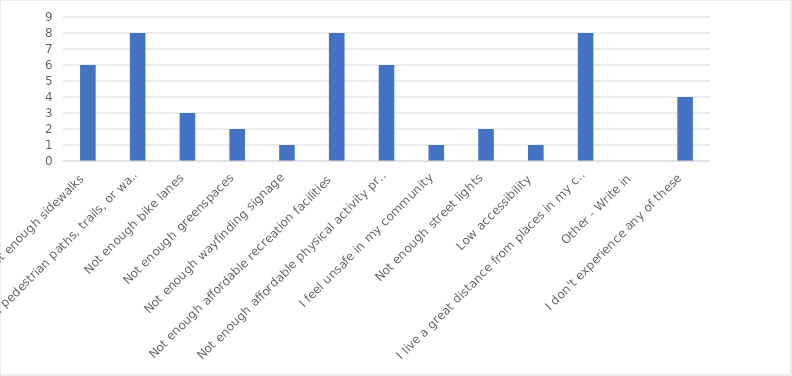
| Category | Number of Responses |
|---|---|
| Not enough sidewalks | 6 |
| Not enough pedestrian paths, trails, or walkways | 8 |
| Not enough bike lanes | 3 |
| Not enough greenspaces | 2 |
| Not enough wayfinding signage | 1 |
| Not enough affordable recreation facilities | 8 |
| Not enough affordable physical activity programs | 6 |
| I feel unsafe in my community | 1 |
| Not enough street lights | 2 |
| Low accessibility | 1 |
| I live a great distance from places in my community | 8 |
| Other - Write in | 0 |
| I don't experience any of these | 4 |